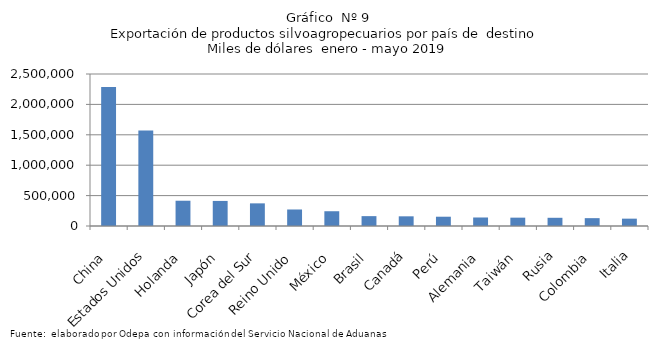
| Category | Series 0 |
|---|---|
| China | 2287232.612 |
| Estados Unidos | 1572582.07 |
| Holanda | 415605.345 |
| Japón | 412324.72 |
| Corea del Sur | 372467.018 |
| Reino Unido | 271543.549 |
| México | 242852.932 |
| Brasil | 162250.061 |
| Canadá | 159240.224 |
| Perú | 152717.291 |
| Alemania | 139938.717 |
| Taiwán | 137264.841 |
| Rusia | 134999.357 |
| Colombia | 129125.641 |
| Italia | 120765.904 |